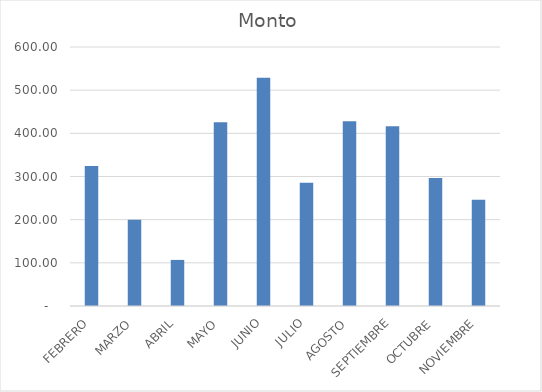
| Category | Monto |
|---|---|
| FEBRERO | 324.45 |
| MARZO | 199.97 |
| ABRIL | 106.73 |
| MAYO | 425.47 |
| JUNIO | 528.9 |
| JULIO | 285.65 |
| AGOSTO | 427.82 |
| SEPTIEMBRE | 416.58 |
| OCTUBRE | 296.35 |
| NOVIEMBRE | 246.1 |